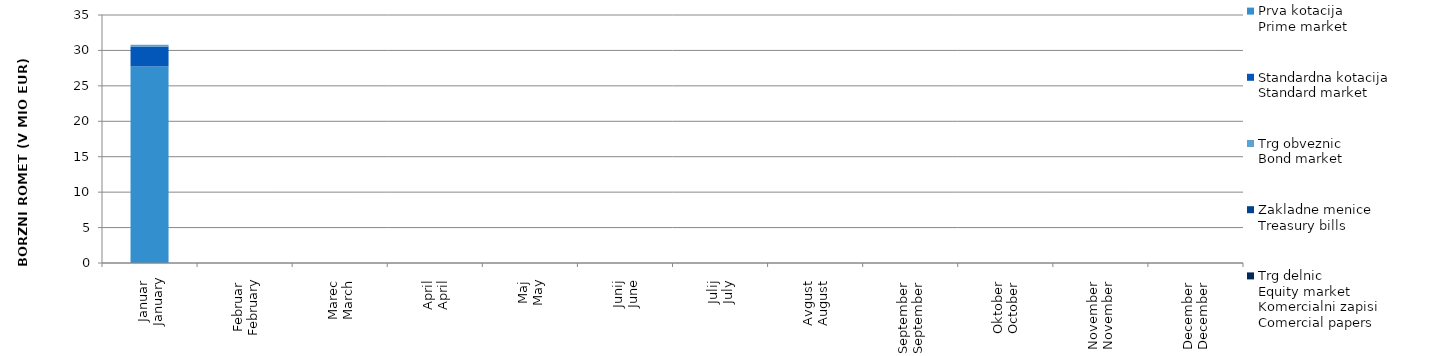
| Category | Prva kotacija
Prime market | Standardna kotacija
Standard market | Trg obveznic
Bond market | Zakladne menice
Treasury bills | Trg delnic
Equity market |
|---|---|---|---|---|---|
| Januar
January | 27.745 | 2.796 | 0.249 | 0 | 0 |
| Februar
February | 0 | 0 | 0 | 0 | 0 |
| Marec
March | 0 | 0 | 0 | 0 | 0 |
| April
April | 0 | 0 | 0 | 0 | 0 |
| Maj
May | 0 | 0 | 0 | 0 | 0 |
| Junij
June | 0 | 0 | 0 | 0 | 0 |
| Julij
July | 0 | 0 | 0 | 0 | 0 |
| Avgust
August | 0 | 0 | 0 | 0 | 0 |
| September
September | 0 | 0 | 0 | 0 | 0 |
| Oktober
October | 0 | 0 | 0 | 0 | 0 |
| November
November | 0 | 0 | 0 | 0 | 0 |
| December
December | 0 | 0 | 0 | 0 | 0 |